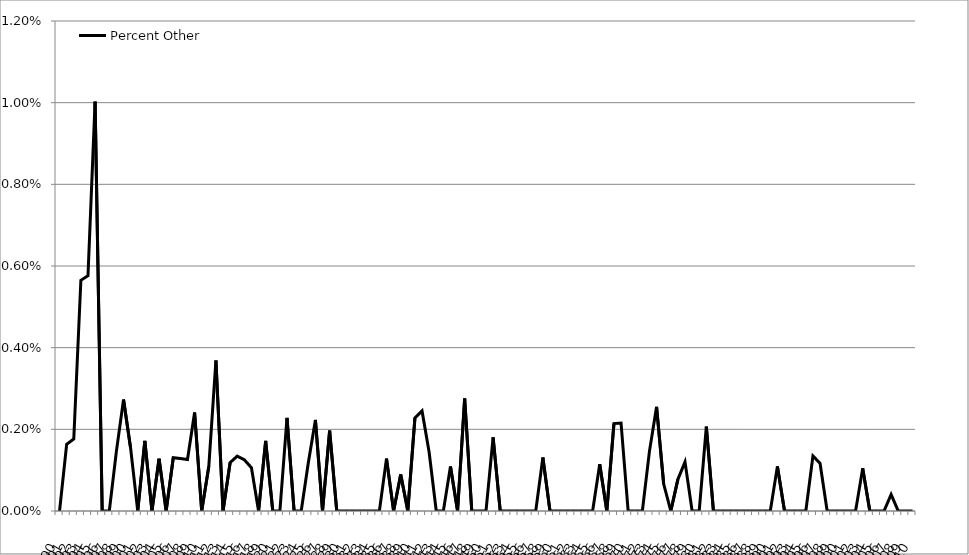
| Category | Percent Other |
|---|---|
| 1890.0 | 0 |
| 1891.0 | 0.002 |
| 1892.0 | 0.002 |
| 1893.0 | 0.006 |
| 1894.0 | 0.006 |
| 1895.0 | 0.01 |
| 1896.0 | 0 |
| 1897.0 | 0 |
| 1898.0 | 0.001 |
| 1899.0 | 0.003 |
| 1900.0 | 0.002 |
| 1901.0 | 0 |
| 1902.0 | 0.002 |
| 1903.0 | 0 |
| 1904.0 | 0.001 |
| 1905.0 | 0 |
| 1906.0 | 0.001 |
| 1907.0 | 0.001 |
| 1908.0 | 0.001 |
| 1909.0 | 0.002 |
| 1910.0 | 0 |
| 1911.0 | 0.001 |
| 1912.0 | 0.004 |
| 1913.0 | 0 |
| 1914.0 | 0.001 |
| 1915.0 | 0.001 |
| 1916.0 | 0.001 |
| 1917.0 | 0.001 |
| 1918.0 | 0 |
| 1919.0 | 0.002 |
| 1920.0 | 0 |
| 1921.0 | 0 |
| 1922.0 | 0.002 |
| 1923.0 | 0 |
| 1924.0 | 0 |
| 1925.0 | 0.001 |
| 1926.0 | 0.002 |
| 1927.0 | 0 |
| 1928.0 | 0.002 |
| 1929.0 | 0 |
| 1930.0 | 0 |
| 1931.0 | 0 |
| 1932.0 | 0 |
| 1933.0 | 0 |
| 1934.0 | 0 |
| 1935.0 | 0 |
| 1936.0 | 0.001 |
| 1937.0 | 0 |
| 1938.0 | 0.001 |
| 1939.0 | 0 |
| 1940.0 | 0.002 |
| 1941.0 | 0.002 |
| 1942.0 | 0.001 |
| 1943.0 | 0 |
| 1944.0 | 0 |
| 1945.0 | 0.001 |
| 1946.0 | 0 |
| 1947.0 | 0.003 |
| 1948.0 | 0 |
| 1949.0 | 0 |
| 1950.0 | 0 |
| 1951.0 | 0.002 |
| 1952.0 | 0 |
| 1953.0 | 0 |
| 1954.0 | 0 |
| 1955.0 | 0 |
| 1956.0 | 0 |
| 1957.0 | 0 |
| 1958.0 | 0.001 |
| 1959.0 | 0 |
| 1960.0 | 0 |
| 1961.0 | 0 |
| 1962.0 | 0 |
| 1963.0 | 0 |
| 1964.0 | 0 |
| 1965.0 | 0 |
| 1966.0 | 0.001 |
| 1967.0 | 0 |
| 1968.0 | 0.002 |
| 1969.0 | 0.002 |
| 1970.0 | 0 |
| 1971.0 | 0 |
| 1972.0 | 0 |
| 1973.0 | 0.001 |
| 1974.0 | 0.003 |
| 1975.0 | 0.001 |
| 1976.0 | 0 |
| 1977.0 | 0.001 |
| 1978.0 | 0.001 |
| 1979.0 | 0 |
| 1980.0 | 0 |
| 1981.0 | 0.002 |
| 1982.0 | 0 |
| 1983.0 | 0 |
| 1984.0 | 0 |
| 1985.0 | 0 |
| 1986.0 | 0 |
| 1987.0 | 0 |
| 1988.0 | 0 |
| 1989.0 | 0 |
| 1990.0 | 0 |
| 1991.0 | 0.001 |
| 1992.0 | 0 |
| 1993.0 | 0 |
| 1994.0 | 0 |
| 1995.0 | 0 |
| 1996.0 | 0.001 |
| 1997.0 | 0.001 |
| 1998.0 | 0 |
| 1999.0 | 0 |
| 2000.0 | 0 |
| 2001.0 | 0 |
| 2002.0 | 0 |
| 2003.0 | 0.001 |
| 2004.0 | 0 |
| 2005.0 | 0 |
| 2006.0 | 0 |
| 2007.0 | 0 |
| 2008.0 | 0 |
| 2009.0 | 0 |
| 2010.0 | 0 |